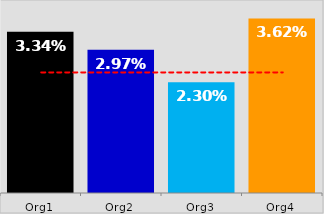
| Category | KPI / Metric |
|---|---|
| Org1 | 0.033 |
| Org2 | 0.03 |
| Org3 | 0.023 |
| Org4 | 0.036 |